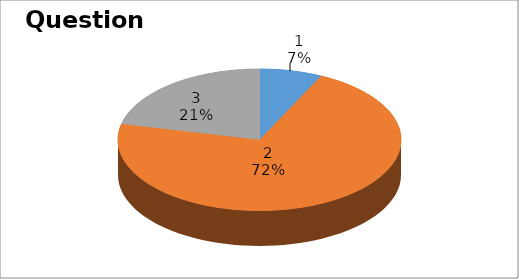
| Category | Series 0 |
|---|---|
| 0 | 1 |
| 1 | 10 |
| 2 | 3 |